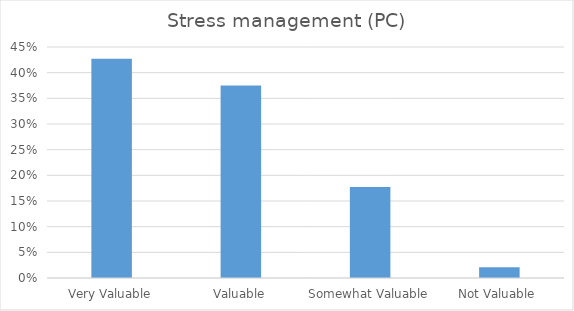
| Category | Stress management (PC) |
|---|---|
| Very Valuable | 0.427 |
| Valuable | 0.375 |
| Somewhat Valuable | 0.177 |
| Not Valuable | 0.021 |